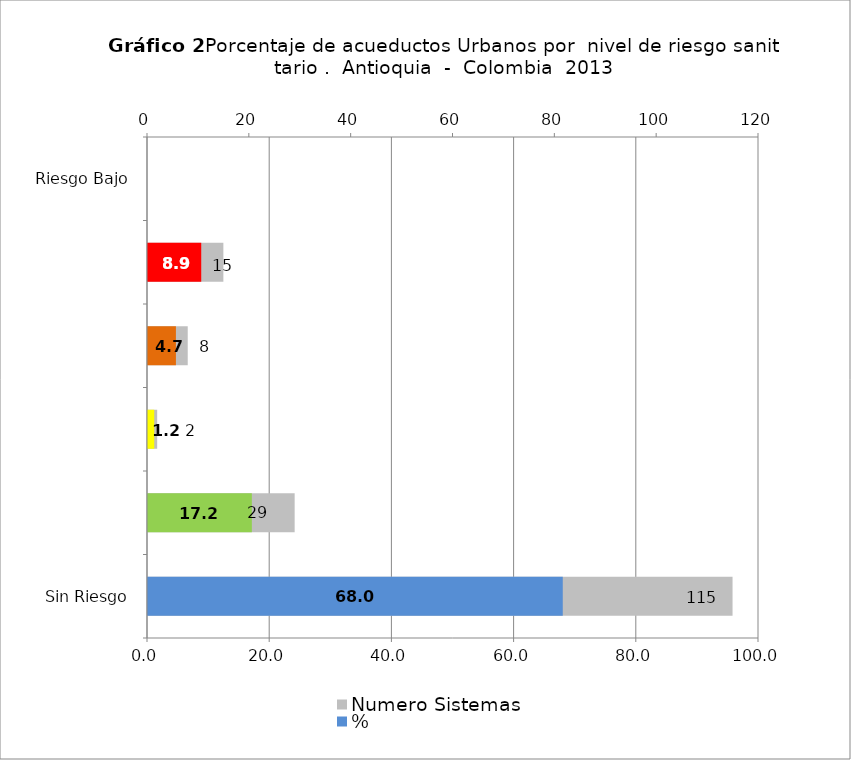
| Category | Numero Sistemas |
|---|---|
| Sin Riesgo | 115 |
| Riesgo Bajo | 29 |
| Riesgo Medio | 2 |
| Riesgo Alto | 8 |
| Inviable Sanitariamente | 15 |
| Sin Dato | 0 |